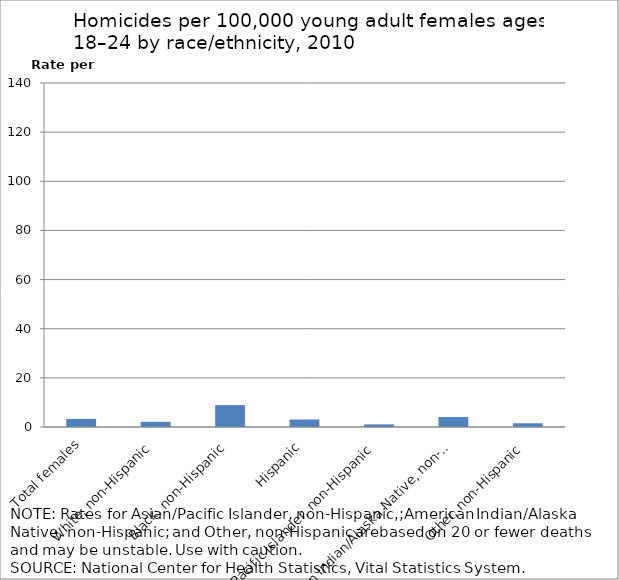
| Category | Series 0 |
|---|---|
| Total females | 3.3 |
| White, non-Hispanic | 2.11 |
| Black, non-Hispanic | 8.9 |
| Hispanic | 3.04 |
| Asian/Pacific Islander, non-Hispanic | 1.07 |
| American Indian/Alaska Native, non-Hispanic | 4.05 |
| Other, non-Hispanic | 1.52 |